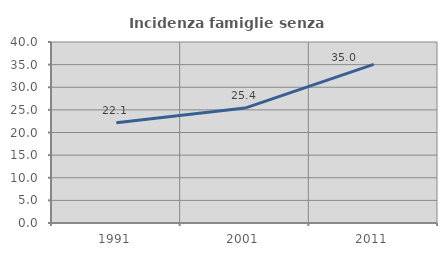
| Category | Incidenza famiglie senza nuclei |
|---|---|
| 1991.0 | 22.131 |
| 2001.0 | 25.403 |
| 2011.0 | 35.041 |